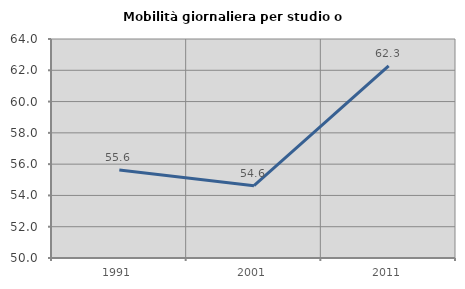
| Category | Mobilità giornaliera per studio o lavoro |
|---|---|
| 1991.0 | 55.622 |
| 2001.0 | 54.623 |
| 2011.0 | 62.286 |